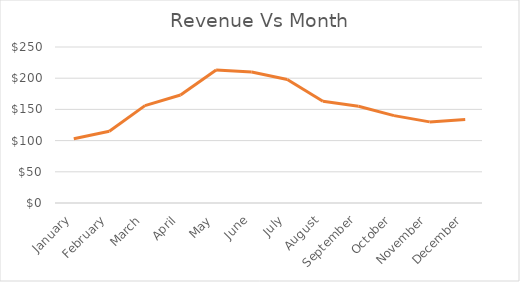
| Category | Revenue |
|---|---|
| January | 103 |
| February | 115 |
| March | 156 |
| April | 173 |
| May | 213 |
| June | 210 |
| July | 198 |
| August | 163 |
| September | 155 |
| October | 140 |
| November | 130 |
| December | 134 |